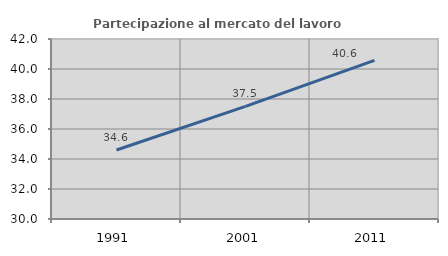
| Category | Partecipazione al mercato del lavoro  femminile |
|---|---|
| 1991.0 | 34.601 |
| 2001.0 | 37.507 |
| 2011.0 | 40.573 |